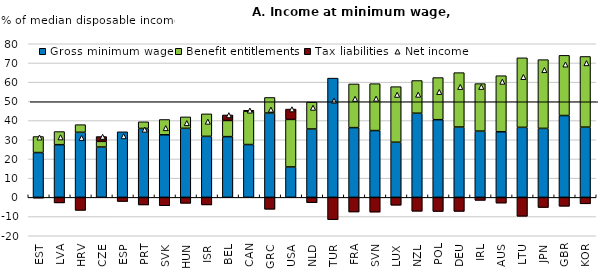
| Category | Gross minimum wage | Benefit entitlements | Tax liabilities |
|---|---|---|---|
| EST | 23.337 | 8.344 | -0.373 |
| LVA | 27.433 | 6.832 | -2.88 |
| HRV | 33.886 | 3.978 | -6.777 |
| CZE | 26.212 | 2.949 | 2.509 |
| ESP | 34.148 | 0 | -2.168 |
| PRT | 35.888 | 3.457 | -3.948 |
| SVK | 32.59 | 7.965 | -4.367 |
| HUN | 35.965 | 5.942 | -3.113 |
| ISR | 31.779 | 11.704 | -3.933 |
| BEL | 31.622 | 8.415 | 2.885 |
| CAN | 27.509 | 17.398 | 0.441 |
| GRC | 43.921 | 8.108 | -6.202 |
| USA | 15.842 | 24.74 | 5.402 |
| NLD | 35.613 | 13.969 | -2.784 |
| TUR | 62.105 | 0 | -11.622 |
| FRA | 36.316 | 22.759 | -7.619 |
| SVN | 34.778 | 24.437 | -7.686 |
| LUX | 28.709 | 28.944 | -4.098 |
| NZL | 43.824 | 17.034 | -7.246 |
| POL | 40.444 | 21.942 | -7.357 |
| DEU | 36.639 | 28.322 | -7.319 |
| IRL | 34.499 | 24.749 | -1.573 |
| AUS | 34.172 | 29.186 | -2.983 |
| LTU | 36.459 | 36.218 | -9.858 |
| JPN | 35.925 | 35.796 | -5.291 |
| GBR | 42.621 | 31.341 | -4.637 |
| KOR | 36.582 | 36.796 | -3.36 |